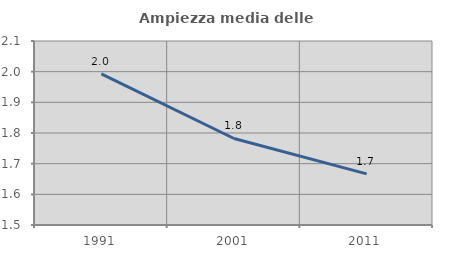
| Category | Ampiezza media delle famiglie |
|---|---|
| 1991.0 | 1.993 |
| 2001.0 | 1.782 |
| 2011.0 | 1.667 |